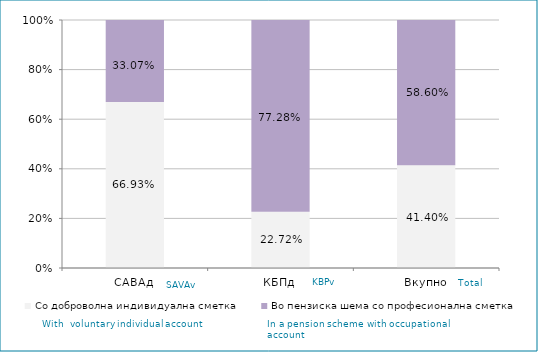
| Category | Со доброволна индивидуална сметка  | Во пензиска шема со професионална сметка |
|---|---|---|
| САВАд | 0.669 | 0.331 |
| КБПд | 0.227 | 0.773 |
| Вкупно | 0.414 | 0.586 |